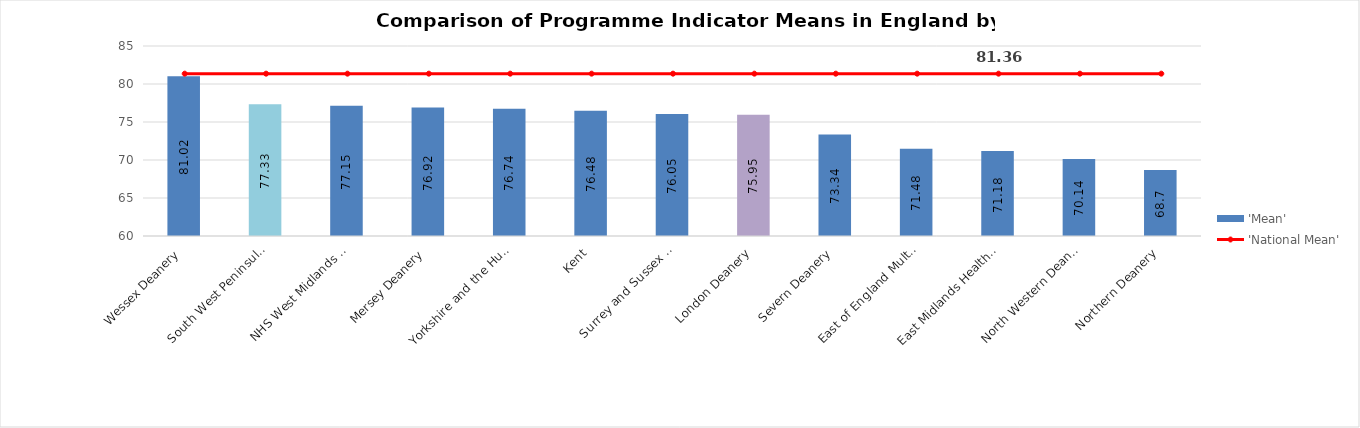
| Category | 'Mean' |
|---|---|
| Wessex Deanery | 81.02 |
| South West Peninsula Deanery | 77.33 |
| NHS West Midlands Workforce Deanery | 77.15 |
| Mersey Deanery | 76.92 |
| Yorkshire and the Humber Postgraduate Deanery | 76.74 |
| Kent, Surrey and Sussex Deanery | 76.48 |
| London Deanery | 76.05 |
| Severn Deanery | 75.95 |
| East of England Multi-Professional Deanery | 73.34 |
| East Midlands Healthcare Workforce Deanery | 71.48 |
| North Western Deanery | 71.18 |
| Northern Deanery | 70.14 |
| Oxford Deanery | 68.7 |